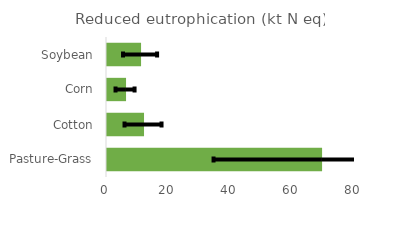
| Category | Reduced eutrophication (kt N eq) |
|---|---|
| Pasture-Grass | 69.381 |
| Cotton | 11.942 |
| Corn | 6.142 |
| Soybean | 10.986 |